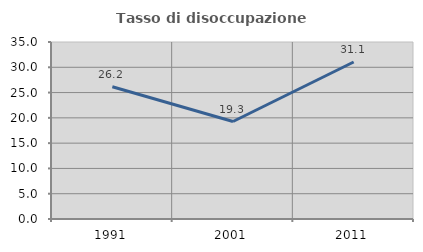
| Category | Tasso di disoccupazione giovanile  |
|---|---|
| 1991.0 | 26.163 |
| 2001.0 | 19.277 |
| 2011.0 | 31.05 |